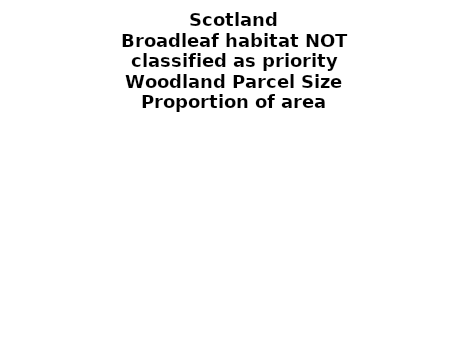
| Category | Broadleaf habitat NOT classified as priority |
|---|---|
| <5 ha | 0.2 |
| ≥5 and <10 ha | 0.135 |
| ≥10 and <15 ha | 0.099 |
| ≥15 and <20 ha | 0.019 |
| ≥20 and <25 ha | 0.03 |
| ≥25 and <30 ha | 0.009 |
| ≥30 and <35 ha | 0.003 |
| ≥35 and <40 ha | 0.009 |
| ≥40 and <45 ha | 0.014 |
| ≥45 and <50 ha | 0.002 |
| ≥50 and <60 ha | 0.031 |
| ≥60 and <70 ha | 0.021 |
| ≥70 and <80 ha | 0.001 |
| ≥80 and <90 ha | 0.015 |
| ≥90 and <100 ha | 0.029 |
| ≥100 and <150 ha | 0.04 |
| ≥150 and <200 ha | 0.016 |
| ≥200 ha | 0.326 |